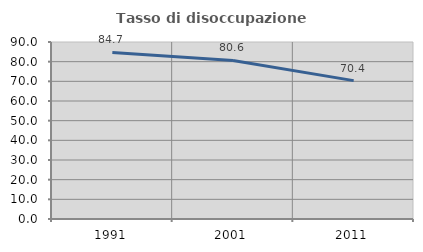
| Category | Tasso di disoccupazione giovanile  |
|---|---|
| 1991.0 | 84.706 |
| 2001.0 | 80.645 |
| 2011.0 | 70.37 |